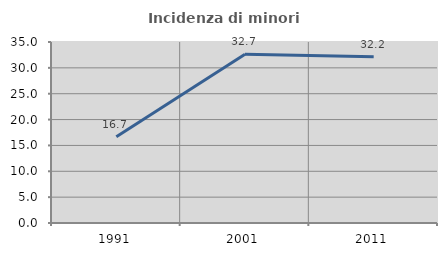
| Category | Incidenza di minori stranieri |
|---|---|
| 1991.0 | 16.667 |
| 2001.0 | 32.653 |
| 2011.0 | 32.164 |